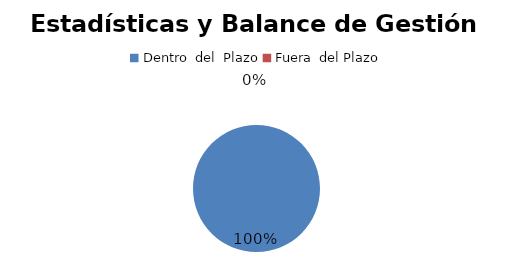
| Category | Series 0 |
|---|---|
| 0 | 6 |
| 1 | 0 |